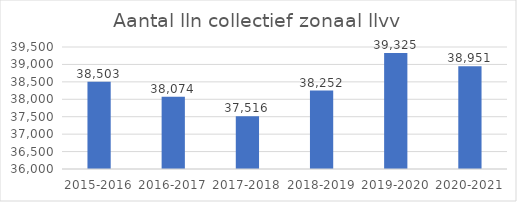
| Category | Aantal lln |
|---|---|
| 2015-2016 | 38503 |
| 2016-2017 | 38074 |
| 2017-2018 | 37516 |
| 2018-2019 | 38252 |
| 2019-2020 | 39325 |
| 2020-2021 | 38951 |